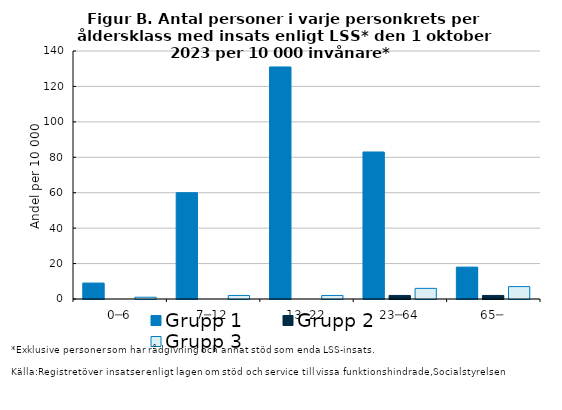
| Category | Grupp 1  | Grupp 2  | Grupp 3  |
|---|---|---|---|
| 0─6 | 9 | 0 | 1 |
| 7─12 | 60 | 0 | 2 |
| 13─22 | 131 | 0 | 2 |
| 23─64 | 83 | 2 | 6 |
| 65─ | 18 | 2 | 7 |